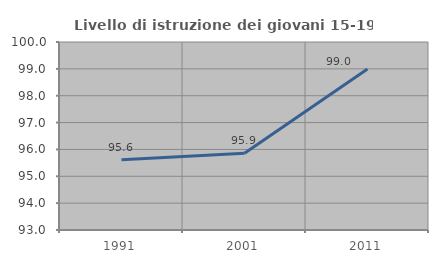
| Category | Livello di istruzione dei giovani 15-19 anni |
|---|---|
| 1991.0 | 95.618 |
| 2001.0 | 95.858 |
| 2011.0 | 98.995 |